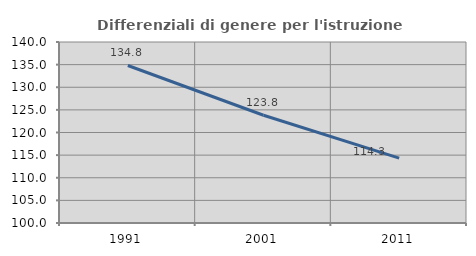
| Category | Differenziali di genere per l'istruzione superiore |
|---|---|
| 1991.0 | 134.808 |
| 2001.0 | 123.812 |
| 2011.0 | 114.342 |